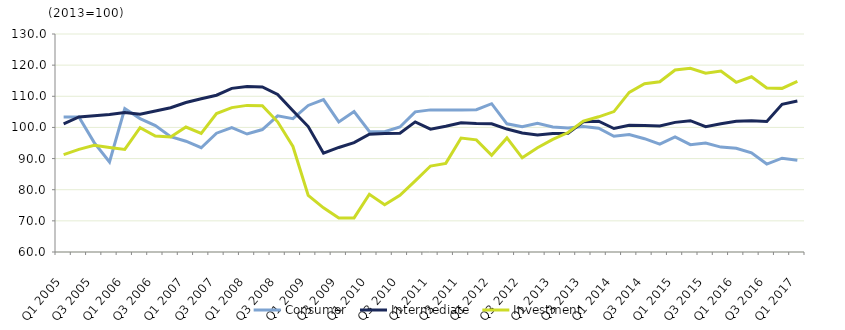
| Category | Consumer | Intermediate | Investment |
|---|---|---|---|
| Q1 2005 | 103.33 | 101.172 | 91.264 |
| Q2 2005 | 103.365 | 103.351 | 92.958 |
| Q3 2005 | 95.128 | 103.784 | 94.257 |
| Q4 2005 | 88.893 | 104.128 | 93.589 |
| Q1 2006 | 106.062 | 104.811 | 92.942 |
| Q2 2006 | 102.846 | 104.22 | 99.934 |
| Q3 2006 | 100.584 | 105.262 | 97.247 |
| Q4 2006 | 97.031 | 106.327 | 96.9 |
| Q1 2007 | 95.58 | 108.006 | 100.132 |
| Q2 2007 | 93.479 | 109.225 | 98.111 |
| Q3 2007 | 98.149 | 110.337 | 104.471 |
| Q4 2007 | 99.924 | 112.546 | 106.358 |
| Q1 2008 | 97.879 | 113.122 | 107.079 |
| Q2 2008 | 99.315 | 113.017 | 106.954 |
| Q3 2008 | 103.706 | 110.615 | 101.797 |
| Q4 2008 | 102.79 | 105.361 | 93.886 |
| Q1 2009 | 107.061 | 100.275 | 78.192 |
| Q2 2009 | 108.949 | 91.714 | 74.19 |
| Q3 2009 | 101.765 | 93.571 | 70.886 |
| Q4 2009 | 105.102 | 95.127 | 70.942 |
| Q1 2010 | 98.724 | 97.845 | 78.529 |
| Q2 2010 | 98.641 | 98.089 | 75.17 |
| Q3 2010 | 100.147 | 98.121 | 78.216 |
| Q4 2010 | 104.997 | 101.769 | 82.818 |
| Q1 2011 | 105.635 | 99.433 | 87.602 |
| Q2 2011 | 105.606 | 100.38 | 88.456 |
| Q3 2011 | 105.56 | 101.504 | 96.582 |
| Q4 2011 | 105.71 | 101.256 | 96.014 |
| Q1 2012 | 107.617 | 101.18 | 91.034 |
| Q2 2012 | 101.169 | 99.478 | 96.634 |
| Q3 2012 | 100.203 | 98.201 | 90.25 |
| Q4 2012 | 101.36 | 97.594 | 93.487 |
| Q1 2013 | 100.15 | 98.029 | 96.173 |
| Q2 2013 | 99.851 | 98.107 | 98.364 |
| Q3 2013 | 100.257 | 101.845 | 102.051 |
| Q4 2013 | 99.742 | 102.019 | 103.412 |
| Q1 2014 | 97.145 | 99.648 | 105.084 |
| Q2 2014 | 97.712 | 100.682 | 111.242 |
| Q3 2014 | 96.379 | 100.632 | 114.043 |
| Q4 2014 | 94.626 | 100.498 | 114.651 |
| Q1 2015 | 96.979 | 101.624 | 118.432 |
| Q2 2015 | 94.475 | 102.156 | 118.972 |
| Q3 2015 | 95.018 | 100.236 | 117.411 |
| Q4 2015 | 93.683 | 101.196 | 118.089 |
| Q1 2016 | 93.317 | 101.992 | 114.487 |
| Q2 2016 | 91.825 | 102.115 | 116.282 |
| Q3 2016 | 88.247 | 101.941 | 112.671 |
| Q4 2016 | 90.118 | 107.42 | 112.542 |
| Q1 2017 | 89.493 | 108.465 | 114.772 |